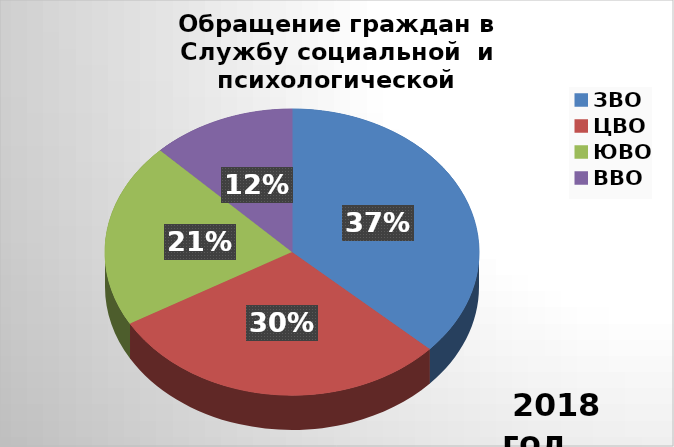
| Category | Series 0 |
|---|---|
| ЗВО | 231 |
| ЦВО | 187 |
| ЮВО | 131 |
| ВВО | 78 |